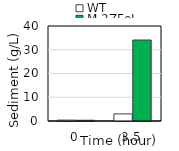
| Category | WT | M-3ZFeL |
|---|---|---|
| 0.0 | 0.37 | 0.32 |
| 3.5 | 3 | 34.1 |